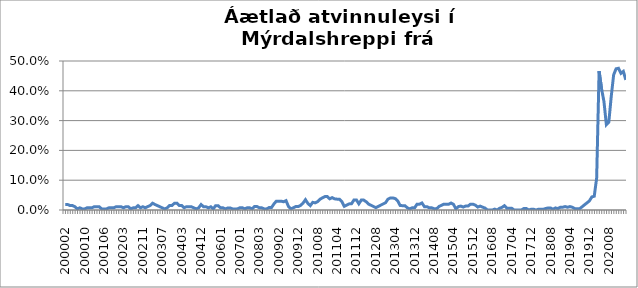
| Category | Series 0 |
|---|---|
| 200002 | 0.019 |
| 200003 | 0.019 |
| 200004 | 0.015 |
| 200005 | 0.015 |
| 200006 | 0.011 |
| 200007 | 0.004 |
| 200008 | 0.007 |
| 200009 | 0.004 |
| 200010 | 0.004 |
| 200011 | 0.007 |
| 200012 | 0.007 |
| 200101 | 0.007 |
| 200102 | 0.011 |
| 200103 | 0.011 |
| 200104 | 0.011 |
| 200105 | 0.004 |
| 200106 | 0.004 |
| 200108 | 0.004 |
| 200109 | 0.007 |
| 200110 | 0.007 |
| 200111 | 0.007 |
| 200112 | 0.011 |
| 200201 | 0.011 |
| 200202 | 0.011 |
| 200203 | 0.007 |
| 200204 | 0.011 |
| 200205 | 0.011 |
| 200206 | 0.004 |
| 200207 | 0.007 |
| 200208 | 0.007 |
| 200209 | 0.015 |
| 200210 | 0.007 |
| 200211 | 0.011 |
| 200212 | 0.007 |
| 200301 | 0.011 |
| 200302 | 0.015 |
| 200303 | 0.023 |
| 200304 | 0.018 |
| 200305 | 0.015 |
| 200306 | 0.011 |
| 200307 | 0.007 |
| 200308 | 0.004 |
| 200309 | 0.007 |
| 200310 | 0.015 |
| 200311 | 0.015 |
| 200312 | 0.023 |
| 200401 | 0.023 |
| 200402 | 0.015 |
| 200403 | 0.015 |
| 200404 | 0.008 |
| 200405 | 0.011 |
| 200406 | 0.011 |
| 200407 | 0.011 |
| 200408 | 0.007 |
| 200410 | 0.004 |
| 200411 | 0.007 |
| 200412 | 0.018 |
| 200501 | 0.011 |
| 200502 | 0.011 |
| 200508 | 0.007 |
| 200509 | 0.011 |
| 200510 | 0.004 |
| 200511 | 0.015 |
| 200512 | 0.015 |
| 200601 | 0.007 |
| 200602 | 0.007 |
| 200603 | 0.004 |
| 200604 | 0.007 |
| 200605 | 0.007 |
| 200606 | 0.003 |
| 200607 | 0.004 |
| 200612 | 0.004 |
| 200701 | 0.008 |
| 200702 | 0.008 |
| 200703 | 0.004 |
| 200704 | 0.007 |
| 200705 | 0.007 |
| 200712 | 0.004 |
| 200801 | 0.012 |
| 200802 | 0.012 |
| 200803 | 0.008 |
| 200804 | 0.007 |
| 200805 | 0.004 |
| 200806 | 0.004 |
| 200810 | 0.008 |
| 200811 | 0.008 |
| 200812 | 0.02 |
| 200901 | 0.03 |
| 200902 | 0.03 |
| 200903 | 0.03 |
| 200904 | 0.028 |
| 200905 | 0.031 |
| 200906 | 0.012 |
| 200907 | 0.004 |
| 200910 | 0.008 |
| 200911 | 0.011 |
| 200912 | 0.011 |
| 201001 | 0.015 |
| 201002 | 0.023 |
| 201003 | 0.035 |
| 201004 | 0.022 |
| 201005 | 0.015 |
| 201006 | 0.026 |
| 201007 | 0.024 |
| 201008 | 0.028 |
| 201009 | 0.036 |
| 201010 | 0.041 |
| 201011 | 0.045 |
| 201012 | 0.045 |
| 201101 | 0.038 |
| 201102 | 0.042 |
| 201103 | 0.038 |
| 201104 | 0.036 |
| 201105 | 0.036 |
| 201106 | 0.028 |
| 201107 | 0.012 |
| 201108 | 0.016 |
| 201109 | 0.02 |
| 201110 | 0.021 |
| 201111 | 0.034 |
| 201112 | 0.034 |
| 201201 | 0.021 |
| 201202 | 0.033 |
| 201203 | 0.033 |
| 201204 | 0.028 |
| 201205 | 0.02 |
| 201206 | 0.016 |
| 201207 | 0.012 |
| 201208 | 0.008 |
| 201209 | 0.012 |
| 201210 | 0.016 |
| 201211 | 0.02 |
| 201212 | 0.024 |
| 201301 | 0.036 |
| 201302 | 0.04 |
| 201303 | 0.04 |
| 201304 | 0.038 |
| 201305 | 0.031 |
| 201306 | 0.015 |
| 201307 | 0.014 |
| 201308 | 0.014 |
| 201309 | 0.007 |
| 201310 | 0.004 |
| 201311 | 0.007 |
| 201312 | 0.007 |
| 201401 | 0.02 |
| 201402 | 0.02 |
| 201403 | 0.024 |
| 201404 | 0.011 |
| 201405 | 0.011 |
| 201406 | 0.008 |
| 201407 | 0.008 |
| 201408 | 0.004 |
| 201409 | 0.004 |
| 201410 | 0.012 |
| 201411 | 0.016 |
| 201412 | 0.02 |
| 201501 | 0.019 |
| 201502 | 0.019 |
| 201503 | 0.023 |
| 201504 | 0.019 |
| 201505 | 0.004 |
| 201506 | 0.011 |
| 201507 | 0.013 |
| 201508 | 0.01 |
| 201509 | 0.013 |
| 201510 | 0.013 |
| 201511 | 0.02 |
| 201512 | 0.02 |
| 201601 | 0.016 |
| 201602 | 0.01 |
| 201603 | 0.013 |
| 201604 | 0.01 |
| 201605 | 0.006 |
| 201606 | 0 |
| 201607 | 0 |
| 201608 | 0 |
| 201609 | 0.003 |
| 201610 | 0 |
| 201611 | 0.006 |
| 201612 | 0.009 |
| 201701 | 0.015 |
| 201702 | 0.006 |
| 201703 | 0.006 |
| 201704 | 0.006 |
| 201705 | 0 |
| 201706 | 0 |
| 201707 | 0 |
| 201708 | 0 |
| 201709 | 0.005 |
| 201710 | 0.005 |
| 201711 | 0 |
| 201712 | 0.003 |
| 201801 | 0.003 |
| 201802 | 0 |
| 201803 | 0.003 |
| 201804 | 0.003 |
| 201805 | 0.003 |
| 201806 | 0.005 |
| 201807 | 0.007 |
| 201808 | 0.007 |
| 201809 | 0.002 |
| 201810 | 0.007 |
| 201811 | 0.005 |
| 201812 | 0.009 |
| 201901 | 0.009 |
| 201902 | 0.011 |
| 201903 | 0.009 |
| 201904 | 0.011 |
| 201905 | 0.009 |
| 201906 | 0.005 |
| 201907 | 0.004 |
| 201908 | 0.004 |
| 201909 | 0.011 |
| 201910 | 0.017 |
| 201911 | 0.024 |
| 201912 | 0.03 |
| 202001 | 0.044 |
| 202002 | 0.046 |
| 202003*** | 0.108 |
| 202004 | 0.466 |
| 202005 | 0.407 |
| 202006 | 0.364 |
| 202007 | 0.286 |
| 202008 | 0.295 |
| 202009 | 0.38 |
| 202010 | 0.454 |
| 202011 | 0.474 |
| 202012 | 0.476 |
| 202101 | 0.459 |
| 202102 | 0.465 |
| 202103 | 0.437 |